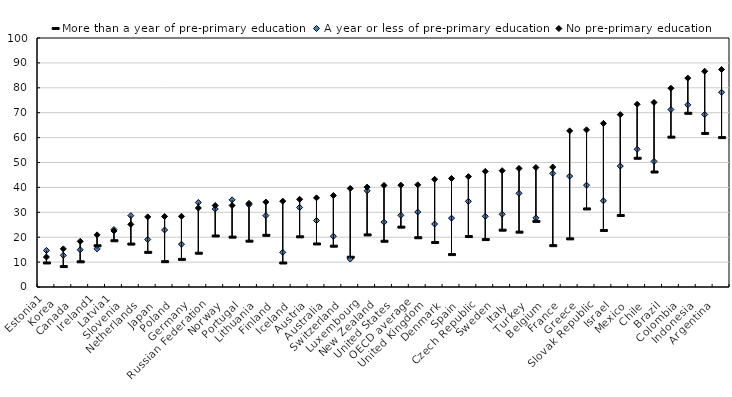
| Category | More than a year of pre-primary education | A year or less of pre-primary education | No pre-primary education |
|---|---|---|---|
| Estonia1 | 9.652 | 14.685 | 12.046 |
| Korea    | 8.206 | 12.715 | 15.304 |
| Canada    | 10.11 | 14.963 | 18.332 |
| Ireland1 | 16.558 | 15.33 | 20.951 |
| Latvia1 | 18.574 | 23.085 | 22.506 |
| Slovenia    | 17.235 | 28.655 | 25.142 |
| Netherlands    | 13.916 | 19.078 | 28.156 |
| Japan    | 10.168 | 22.903 | 28.33 |
| Poland    | 11.097 | 17.175 | 28.395 |
| Germany    | 13.563 | 33.937 | 31.718 |
| Russian Federation    | 20.492 | 31.336 | 32.734 |
| Norway    | 20.025 | 34.997 | 32.736 |
| Portugal    | 18.408 | 33.03 | 33.567 |
| Lithuania    | 20.757 | 28.682 | 34.117 |
| Finland    | 9.643 | 13.918 | 34.472 |
| Iceland    | 20.153 | 31.959 | 35.224 |
| Austria    | 17.282 | 26.724 | 35.803 |
| Australia    | 16.387 | 20.387 | 36.739 |
| Switzerland    | 11.948 | 11.241 | 39.566 |
| Luxembourg    | 20.925 | 38.65 | 40.114 |
| New Zealand    | 18.377 | 26.041 | 40.787 |
| United States    | 24.045 | 28.796 | 40.898 |
| OECD average    | 19.775 | 30.113 | 41.05 |
| United Kingdom    | 17.868 | 25.291 | 43.251 |
| Denmark    | 13.016 | 27.657 | 43.596 |
| Spain    | 20.249 | 34.404 | 44.328 |
| Czech Republic    | 19.045 | 28.379 | 46.423 |
| Sweden    | 22.822 | 29.208 | 46.719 |
| Italy    | 22.029 | 37.625 | 47.605 |
| Turkey    | 26.339 | 27.762 | 47.997 |
| Belgium    | 16.602 | 45.608 | 48.166 |
| France    | 19.332 | 44.516 | 62.71 |
| Greece    | 31.354 | 40.892 | 63.122 |
| Slovak Republic    | 22.709 | 34.607 | 65.702 |
| Israel    | 28.696 | 48.567 | 69.244 |
| Mexico    | 51.705 | 55.314 | 73.388 |
| Chile    | 46.178 | 50.422 | 74.117 |
| Brazil    | 60.183 | 71.262 | 79.829 |
| Colombia    | 69.754 | 73.168 | 83.908 |
| Indonesia    | 61.66 | 69.29 | 86.647 |
| Argentina    | 59.996 | 78.207 | 87.368 |